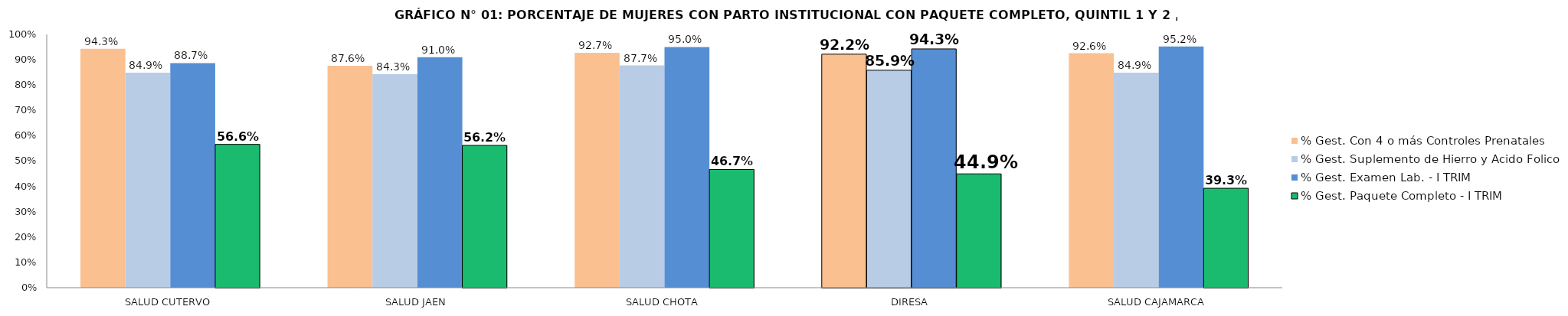
| Category | % Gest. Con 4 o más Controles Prenatales | % Gest. Suplemento de Hierro y Acido Folico | % Gest. Examen Lab. - I TRIM | % Gest. Paquete Completo - I TRIM |
|---|---|---|---|---|
| SALUD CUTERVO | 0.943 | 0.849 | 0.887 | 0.566 |
| SALUD JAEN | 0.876 | 0.843 | 0.91 | 0.562 |
| SALUD CHOTA | 0.927 | 0.877 | 0.95 | 0.467 |
| DIRESA | 0.922 | 0.859 | 0.943 | 0.449 |
| SALUD CAJAMARCA | 0.926 | 0.849 | 0.952 | 0.393 |